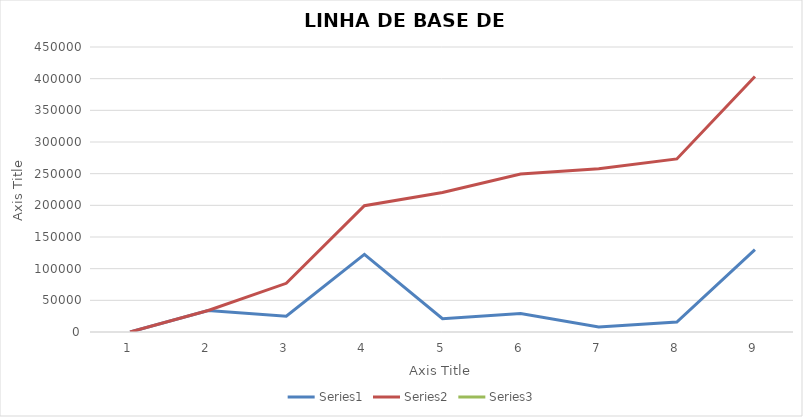
| Category | Series 0 | Series 1 | Series 2 |
|---|---|---|---|
| 0 | 0 | 0 |  |
| 1 | 34000 | 34000 |  |
| 2 | 25000 | 76888 |  |
| 3 | 122500 | 199388 |  |
| 4 | 21000 | 220388 |  |
| 5 | 29200 | 249588 |  |
| 6 | 8000 | 257588 |  |
| 7 | 15700 | 273288 |  |
| 8 | 130000 | 403288 |  |